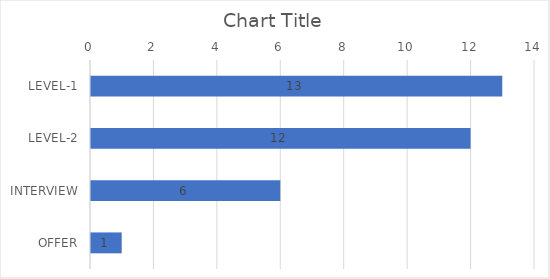
| Category | Series 0 |
|---|---|
| LEVEL-1 | 13 |
| LEVEL-2 | 12 |
| INTERVIEW | 6 |
| OFFER | 1 |